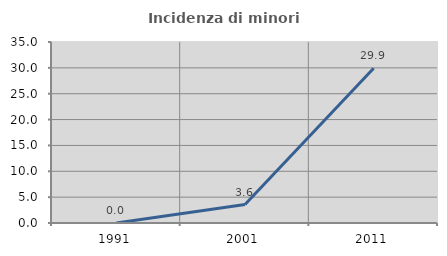
| Category | Incidenza di minori stranieri |
|---|---|
| 1991.0 | 0 |
| 2001.0 | 3.571 |
| 2011.0 | 29.932 |